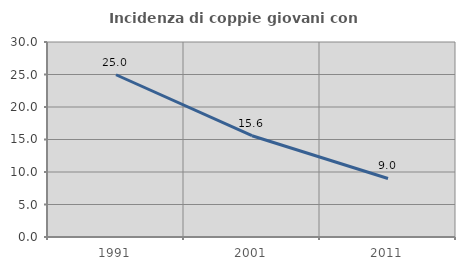
| Category | Incidenza di coppie giovani con figli |
|---|---|
| 1991.0 | 24.961 |
| 2001.0 | 15.578 |
| 2011.0 | 9.003 |